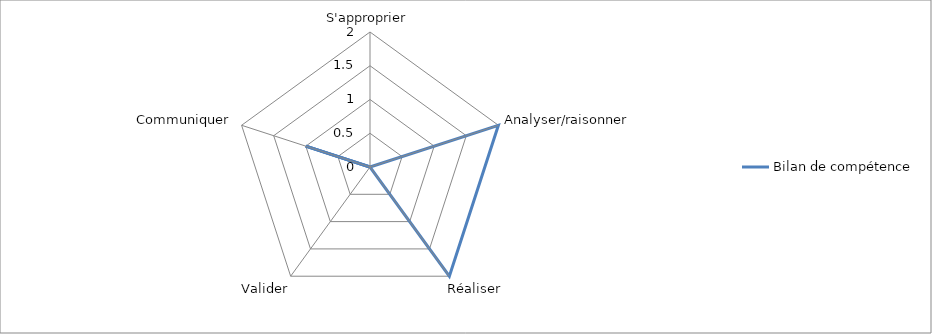
| Category | Bilan de compétence |
|---|---|
| S'approprier | 0 |
| Analyser/raisonner | 2 |
| Réaliser | 2 |
| Valider | 0 |
| Communiquer | 1 |